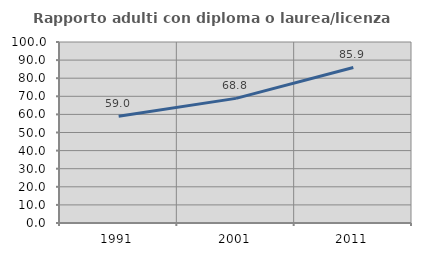
| Category | Rapporto adulti con diploma o laurea/licenza media  |
|---|---|
| 1991.0 | 58.97 |
| 2001.0 | 68.846 |
| 2011.0 | 85.917 |